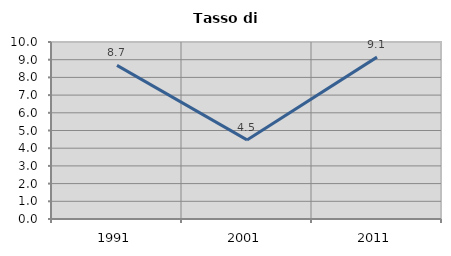
| Category | Tasso di disoccupazione   |
|---|---|
| 1991.0 | 8.678 |
| 2001.0 | 4.468 |
| 2011.0 | 9.146 |